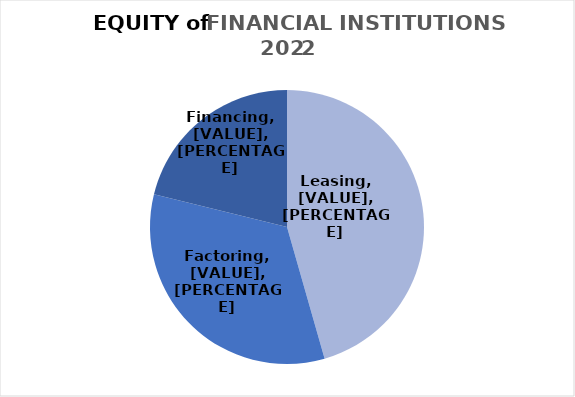
| Category | Series 0 |
|---|---|
| Leasing | 22640 |
| Factoring | 16526 |
| Financing | 10514 |